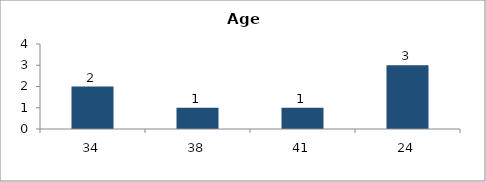
| Category | Age |
|---|---|
| 34.0 | 2 |
| 38.0 | 1 |
| 41.0 | 1 |
| 24.0 | 3 |